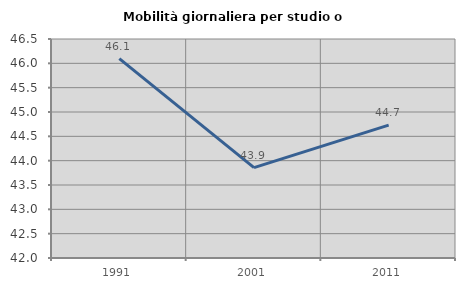
| Category | Mobilità giornaliera per studio o lavoro |
|---|---|
| 1991.0 | 46.098 |
| 2001.0 | 43.856 |
| 2011.0 | 44.731 |